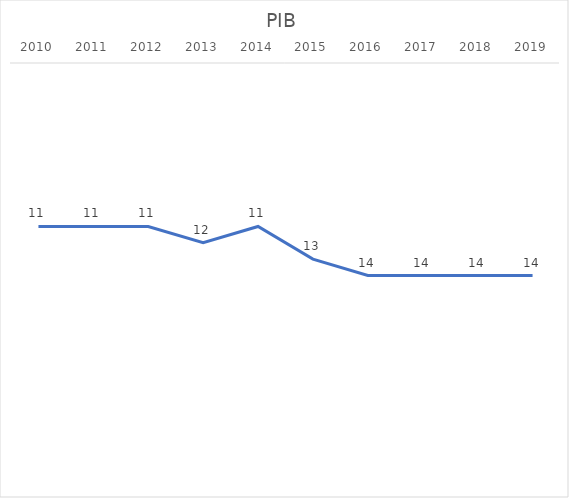
| Category | ES |
|---|---|
| 2010.0 | 11 |
| 2011.0 | 11 |
| 2012.0 | 11 |
| 2013.0 | 12 |
| 2014.0 | 11 |
| 2015.0 | 13 |
| 2016.0 | 14 |
| 2017.0 | 14 |
| 2018.0 | 14 |
| 2019.0 | 14 |